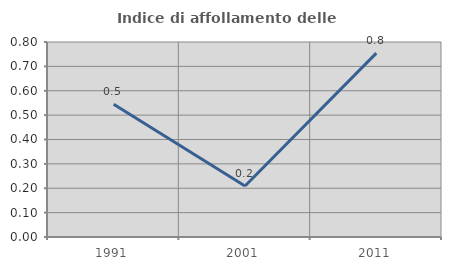
| Category | Indice di affollamento delle abitazioni  |
|---|---|
| 1991.0 | 0.544 |
| 2001.0 | 0.209 |
| 2011.0 | 0.754 |